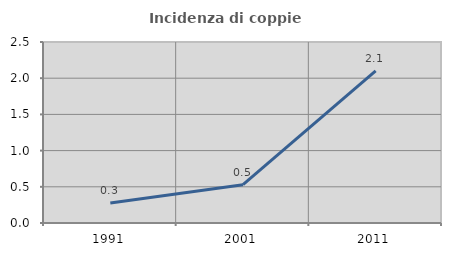
| Category | Incidenza di coppie miste |
|---|---|
| 1991.0 | 0.277 |
| 2001.0 | 0.529 |
| 2011.0 | 2.102 |